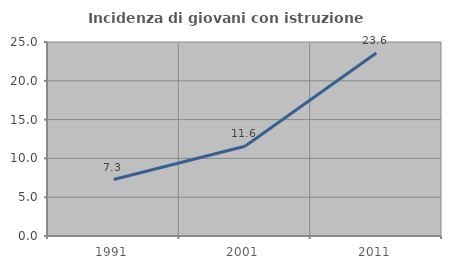
| Category | Incidenza di giovani con istruzione universitaria |
|---|---|
| 1991.0 | 7.277 |
| 2001.0 | 11.567 |
| 2011.0 | 23.593 |